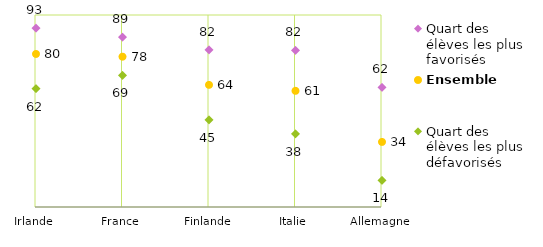
| Category | Quart des élèves les plus favorisés | Ensemble | Quart des élèves les plus défavorisés |
|---|---|---|---|
| Irlande | 93.2 | 79.7 | 61.6 |
| France | 88.5 | 78.3 | 68.5 |
| Finlande | 81.8 | 63.6 | 45.4 |
| Italie | 81.6 | 60.5 | 38.1 |
| Allemagne | 62.3 | 33.9 | 13.9 |